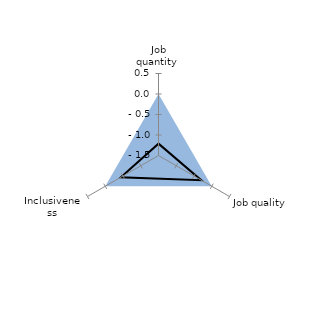
| Category | OECD average | Priority: quantity |
|---|---|---|
| Job quantity  | 0 | -1.21 |
| Job quality  | 0 | -0.297 |
| Inclusiveness | 0 | -0.439 |